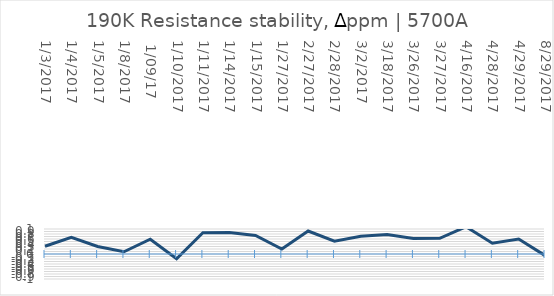
| Category | Series 0 |
|---|---|
| 1/3/2017 | 0.31 |
| 1/4/2017 | 0.67 |
| 1/5/2017 | 0.3 |
| 1/8/2017 | 0.09 |
|  1/09/17 | 0.59 |
| 1/10/2017 | -0.19 |
| 1/11/2017 | 0.85 |
| 1/14/2017 | 0.86 |
| 1/15/2017 | 0.74 |
| 1/27/2017 | 0.2 |
| 2/27/2017 | 0.92 |
| 2/28/2017 | 0.51 |
| 3/2/2017 | 0.71 |
| 3/18/2017 | 0.78 |
| 3/26/2017 | 0.62 |
| 3/27/2017 | 0.63 |
| 4/16/2017 | 1.09 |
| 4/28/2017 | 0.43 |
| 4/29/2017 | 0.6 |
| 8/29/2017 | -0.06 |